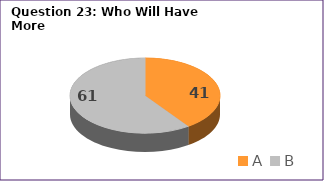
| Category | Series 0 |
|---|---|
| A | 41 |
| B | 61 |